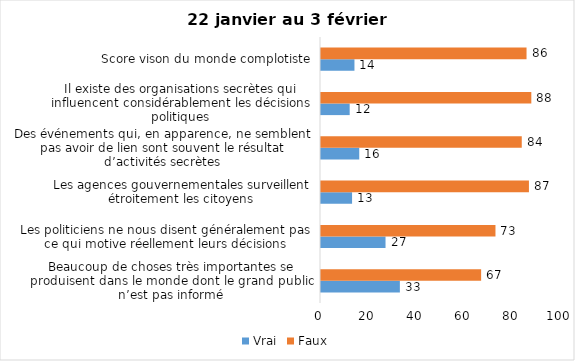
| Category | Vrai | Faux |
|---|---|---|
| Beaucoup de choses très importantes se produisent dans le monde dont le grand public n’est pas informé | 33 | 67 |
| Les politiciens ne nous disent généralement pas ce qui motive réellement leurs décisions | 27 | 73 |
| Les agences gouvernementales surveillent étroitement les citoyens | 13 | 87 |
| Des événements qui, en apparence, ne semblent pas avoir de lien sont souvent le résultat d’activités secrètes | 16 | 84 |
| Il existe des organisations secrètes qui influencent considérablement les décisions politiques | 12 | 88 |
| Score vison du monde complotiste | 14 | 86 |